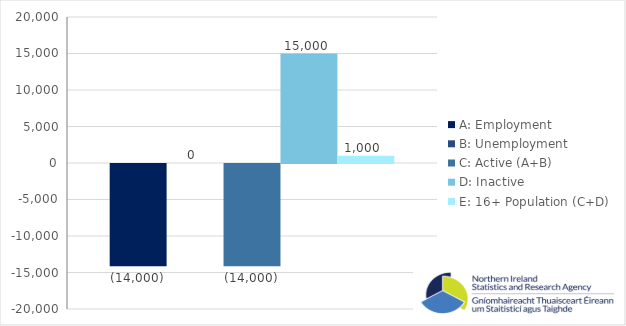
| Category | A: Employment | B: Unemployment | C: Active (A+B) | D: Inactive | E: 16+ Population (C+D) |
|---|---|---|---|---|---|
| 0 | -14000 | 0 | -14000 | 15000 | 1000 |